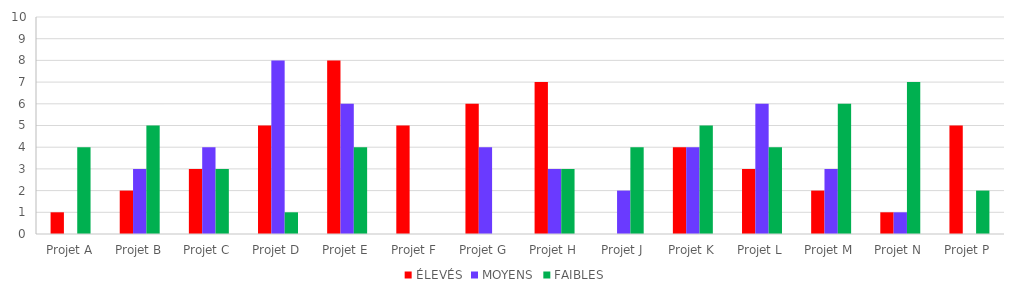
| Category | ÉLEVÉS | MOYENS | FAIBLES |
|---|---|---|---|
| Projet A | 1 | 0 | 4 |
| Projet B | 2 | 3 | 5 |
| Projet C | 3 | 4 | 3 |
| Projet D | 5 | 8 | 1 |
| Projet E | 8 | 6 | 4 |
| Projet F | 5 | 0 | 0 |
| Projet G | 6 | 4 | 0 |
| Projet H | 7 | 3 | 3 |
| Projet J | 0 | 2 | 4 |
| Projet K | 4 | 4 | 5 |
| Projet L | 3 | 6 | 4 |
| Projet M | 2 | 3 | 6 |
| Projet N | 1 | 1 | 7 |
| Projet P | 5 | 0 | 2 |